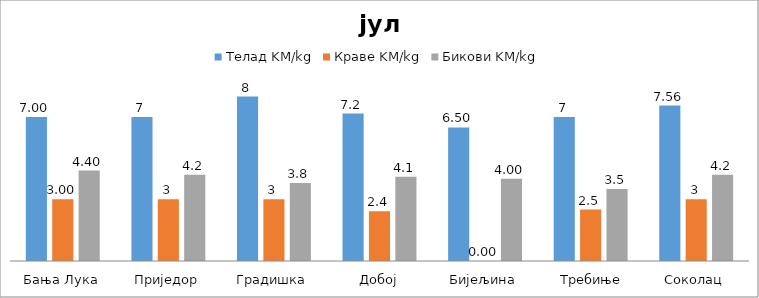
| Category | Телад KM/kg | Краве KM/kg | Бикови KM/kg |
|---|---|---|---|
| Бања Лука | 7 | 3 | 4.4 |
| Приједор | 7 | 3 | 4.2 |
| Градишка | 8 | 3 | 3.8 |
| Добој | 7.175 | 2.425 | 4.1 |
| Бијељина | 6.5 | 0 | 4 |
|  Требиње | 7 | 2.5 | 3.5 |
| Соколац | 7.56 | 3 | 4.2 |